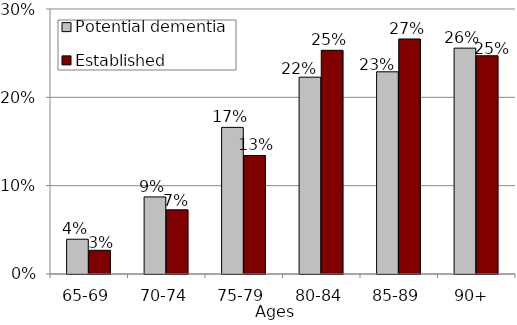
| Category | Potential dementia  | Established dementia  |
|---|---|---|
| 65-69 | 0.039 | 0.027 |
| 70-74 | 0.087 | 0.073 |
| 75-79 | 0.166 | 0.134 |
| 80-84 | 0.223 | 0.253 |
| 85-89 | 0.229 | 0.266 |
| 90+  | 0.256 | 0.247 |